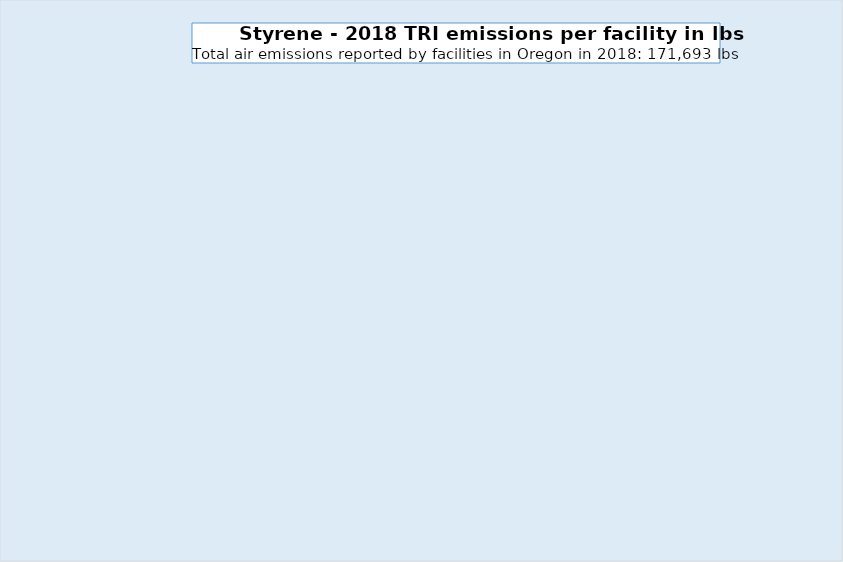
| Category | Series 0 |
|---|---|
| Marquis Corp., Independence | 51450 |
| Miles Fiberglass & Plastics Inc., Happy Valley | 28076 |
| Miles Fiberglass & Plastics Inc., Oregon City | 22122 |
| Orenco Systems, Inc., Sutherlin | 13958 |
| M&W FiberglassInc., Dundee | 13444 |
| SR Smith LLC, Canby | 11454 |
| Shaw's Fiberglass & Plastics Inc., Damascus | 11291 |
| Orenco Systems Inc., Roseburg - Status unknown, not a DEQ permitted source | 8706 |
| McClure Industries Inc., Portland | 8383 |
| 4 other facilities | 2809 |